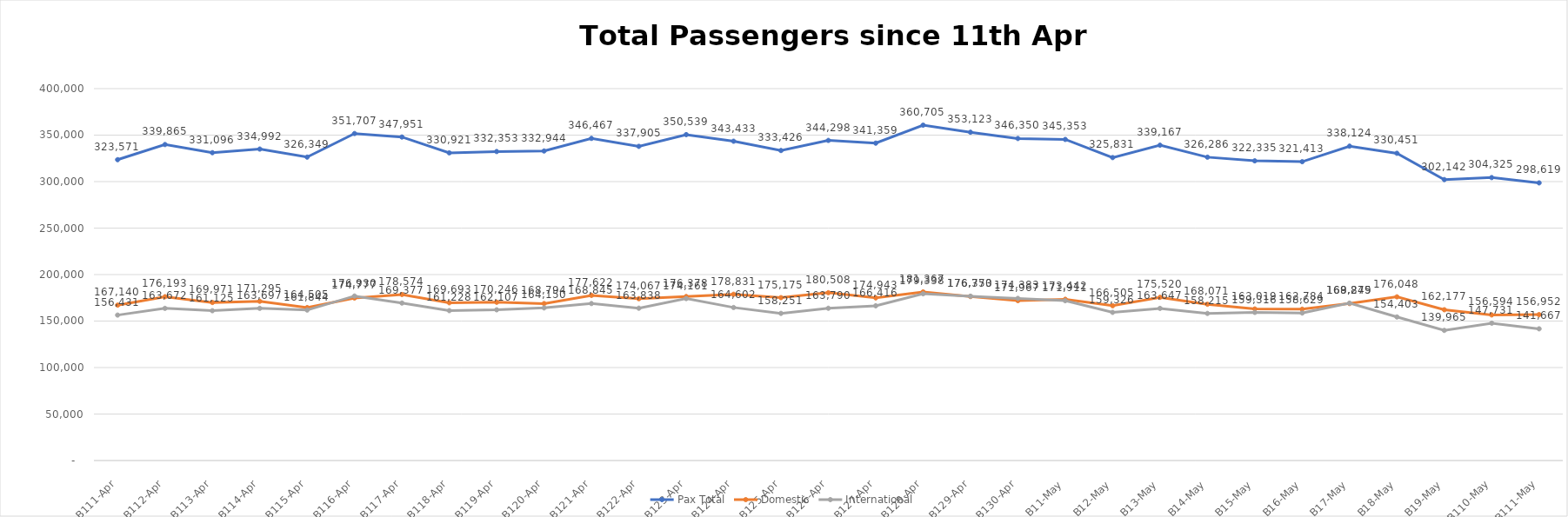
| Category | Pax Total |  Domestic  |  International  |
|---|---|---|---|
| 2023-04-11 | 323571 | 167140 | 156431 |
| 2023-04-12 | 339865 | 176193 | 163672 |
| 2023-04-13 | 331096 | 169971 | 161125 |
| 2023-04-14 | 334992 | 171295 | 163697 |
| 2023-04-15 | 326349 | 164505 | 161844 |
| 2023-04-16 | 351707 | 174777 | 176930 |
| 2023-04-17 | 347951 | 178574 | 169377 |
| 2023-04-18 | 330921 | 169693 | 161228 |
| 2023-04-19 | 332353 | 170246 | 162107 |
| 2023-04-20 | 332944 | 168794 | 164150 |
| 2023-04-21 | 346467 | 177622 | 168845 |
| 2023-04-22 | 337905 | 174067 | 163838 |
| 2023-04-23 | 350539 | 176378 | 174161 |
| 2023-04-24 | 343433 | 178831 | 164602 |
| 2023-04-25 | 333426 | 175175 | 158251 |
| 2023-04-26 | 344298 | 180508 | 163790 |
| 2023-04-27 | 341359 | 174943 | 166416 |
| 2023-04-28 | 360705 | 181367 | 179338 |
| 2023-04-29 | 353123 | 176373 | 176750 |
| 2023-04-30 | 346350 | 171967 | 174383 |
| 2023-05-01 | 345353 | 173442 | 171911 |
| 2023-05-02 | 325831 | 166505 | 159326 |
| 2023-05-03 | 339167 | 175520 | 163647 |
| 2023-05-04 | 326286 | 168071 | 158215 |
| 2023-05-05 | 322335 | 163019 | 159316 |
| 2023-05-06 | 321413 | 162784 | 158629 |
| 2023-05-07 | 338124 | 168849 | 169275 |
| 2023-05-08 | 330451 | 176048 | 154403 |
| 2023-05-09 | 302142 | 162177 | 139965 |
| 2023-05-10 | 304325 | 156594 | 147731 |
| 2023-05-11 | 298619 | 156952 | 141667 |